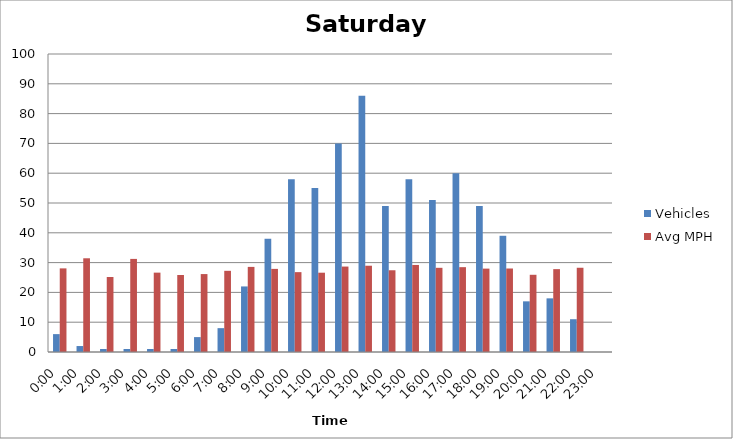
| Category | Vehicles | Avg MPH |
|---|---|---|
| 0:00 | 6 | 28.06 |
| 1:00 | 2 | 31.45 |
| 2:00 | 1 | 25.17 |
| 3:00 | 1 | 31.24 |
| 4:00 | 1 | 26.63 |
| 5:00 | 1 | 25.84 |
| 6:00 | 5 | 26.15 |
| 7:00 | 8 | 27.24 |
| 8:00 | 22 | 28.56 |
| 9:00 | 38 | 27.89 |
| 10:00 | 58 | 26.8 |
| 11:00 | 55 | 26.61 |
| 12:00 | 70 | 28.67 |
| 13:00 | 86 | 28.95 |
| 14:00 | 49 | 27.43 |
| 15:00 | 58 | 29.21 |
| 16:00 | 51 | 28.25 |
| 17:00 | 60 | 28.47 |
| 18:00 | 49 | 27.98 |
| 19:00 | 39 | 28.02 |
| 20:00 | 17 | 25.91 |
| 21:00 | 18 | 27.81 |
| 22:00 | 11 | 28.27 |
| 23:00 | 0 | 0 |